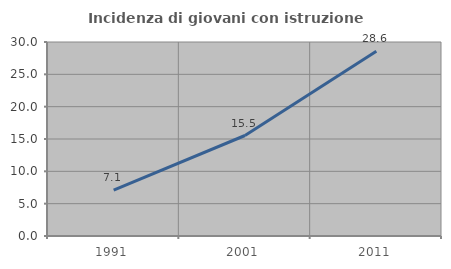
| Category | Incidenza di giovani con istruzione universitaria |
|---|---|
| 1991.0 | 7.087 |
| 2001.0 | 15.541 |
| 2011.0 | 28.571 |